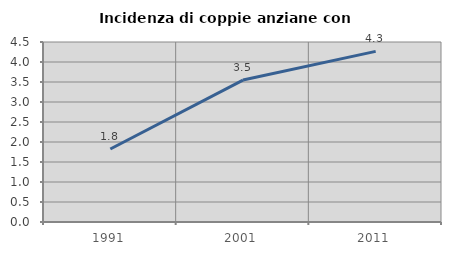
| Category | Incidenza di coppie anziane con figli |
|---|---|
| 1991.0 | 1.825 |
| 2001.0 | 3.549 |
| 2011.0 | 4.266 |